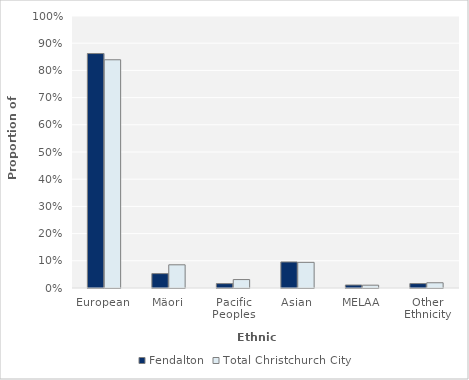
| Category | Fendalton | Total Christchurch City |
|---|---|---|
| European | 0.862 | 0.839 |
| Mäori | 0.053 | 0.085 |
| Pacific Peoples | 0.016 | 0.031 |
| Asian | 0.096 | 0.094 |
| MELAA | 0.011 | 0.01 |
| Other Ethnicity | 0.016 | 0.019 |